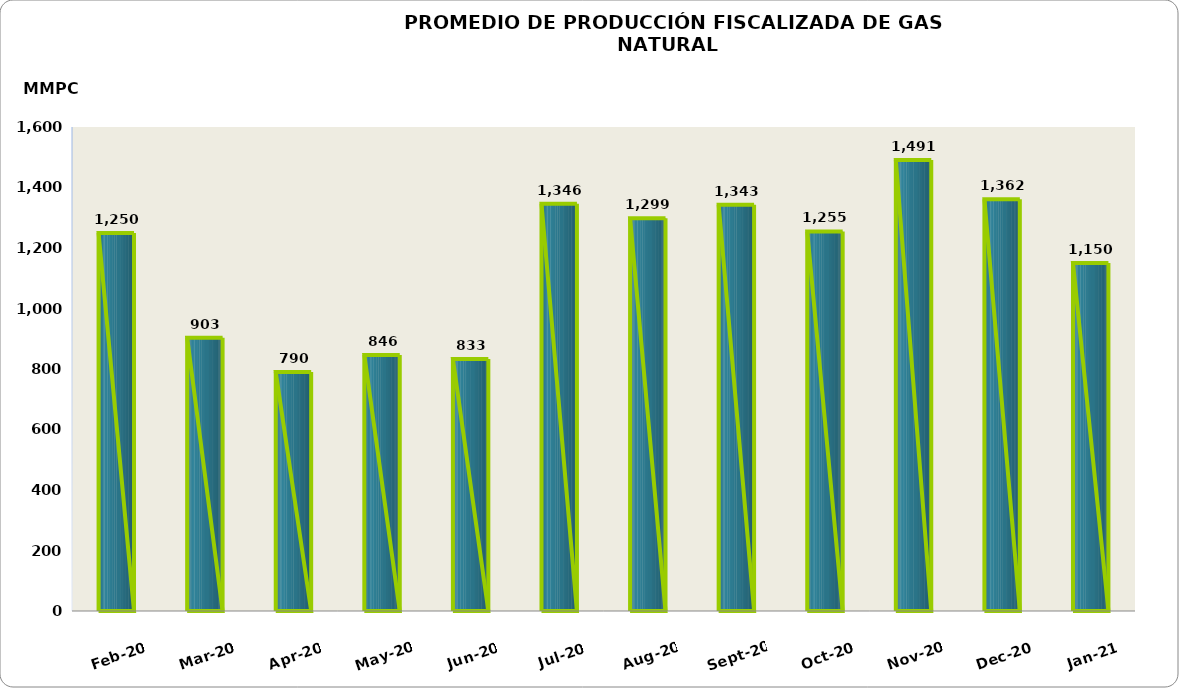
| Category | Series 0 |
|---|---|
| 2020-02-01 | 1249771.288 |
| 2020-03-01 | 903310.04 |
| 2020-04-01 | 790178.83 |
| 2020-05-01 | 845915.213 |
| 2020-06-01 | 832774.501 |
| 2020-07-01 | 1346101.494 |
| 2020-08-01 | 1298655.154 |
| 2020-09-01 | 1342976.236 |
| 2020-10-01 | 1254828.351 |
| 2020-11-01 | 1490754.692 |
| 2020-12-01 | 1361515.502 |
| 2021-01-01 | 1150031.71 |